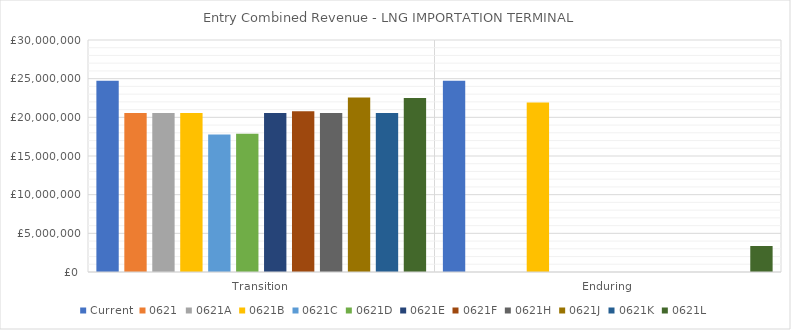
| Category | Current | 0621 | 0621A | 0621B | 0621C | 0621D | 0621E | 0621F | 0621H | 0621J | 0621K | 0621L |
|---|---|---|---|---|---|---|---|---|---|---|---|---|
| Transition | 24738170.184 | 20544751.643 | 20544751.643 | 20544751.643 | 17784159.013 | 17889400.817 | 20544751.643 | 20774698.663 | 20544751.643 | 22552150.634 | 20544751.643 | 22499342.213 |
| Enduring | 24738170.184 | 0 | 0 | 21914596.09 | 0 | 0 | 0 | 0 | 0 | 0 | 0 | 3358856.769 |